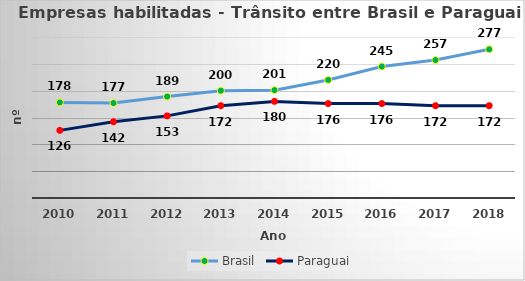
| Category | Brasil | Paraguai |
|---|---|---|
| 2010.0 | 178 | 126 |
| 2011.0 | 177 | 142 |
| 2012.0 | 189 | 153 |
| 2013.0 | 200 | 172 |
| 2014.0 | 201 | 180 |
| 2015.0 | 220 | 176 |
| 2016.0 | 245 | 176 |
| 2017.0 | 257 | 172 |
| 2018.0 | 277 | 172 |